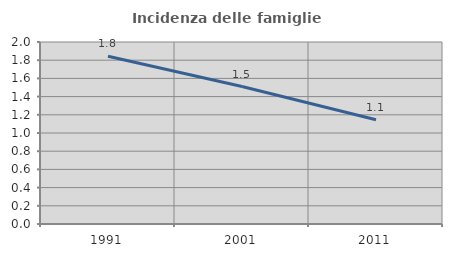
| Category | Incidenza delle famiglie numerose |
|---|---|
| 1991.0 | 1.844 |
| 2001.0 | 1.51 |
| 2011.0 | 1.145 |